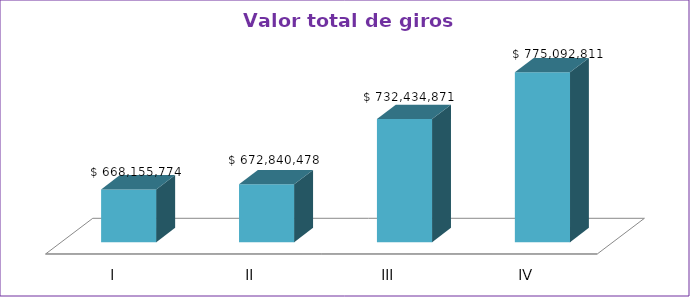
| Category | Series 0 |
|---|---|
| I | 668155774 |
| II | 672840478 |
| III | 732434871 |
| IV | 775092811 |